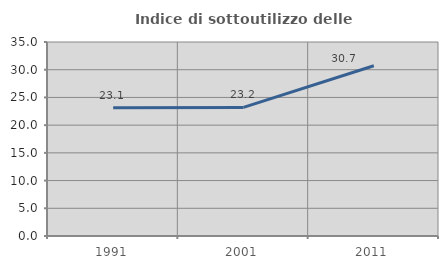
| Category | Indice di sottoutilizzo delle abitazioni  |
|---|---|
| 1991.0 | 23.144 |
| 2001.0 | 23.2 |
| 2011.0 | 30.719 |